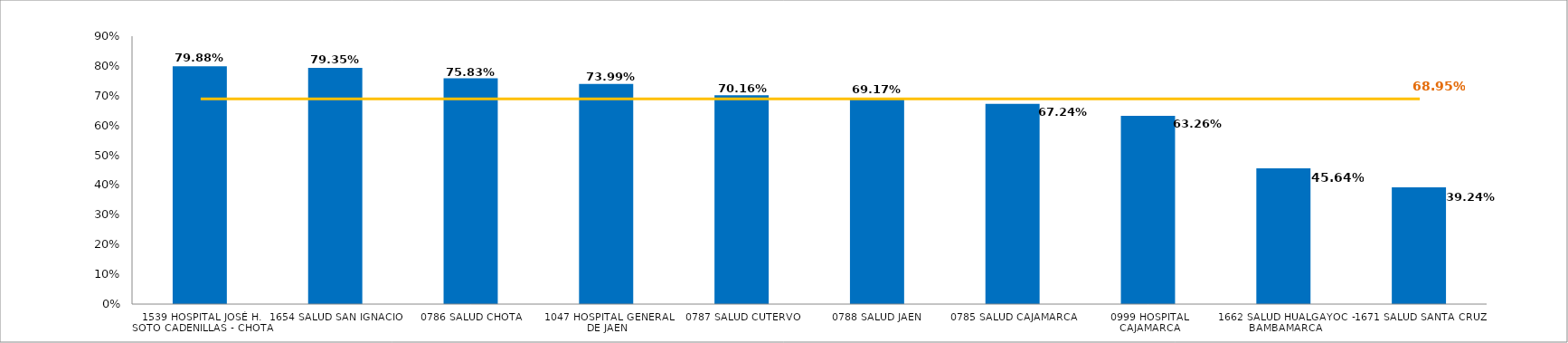
| Category | % EJECUCIÓN  |
|---|---|
| 1539 HOSPITAL JOSÉ H. SOTO CADENILLAS - CHOTA | 0.799 |
| 1654 SALUD SAN IGNACIO | 0.794 |
| 0786 SALUD CHOTA | 0.758 |
| 1047 HOSPITAL GENERAL DE JAEN | 0.74 |
| 0787 SALUD CUTERVO | 0.702 |
| 0788 SALUD JAEN | 0.692 |
| 0785 SALUD CAJAMARCA | 0.672 |
| 0999 HOSPITAL CAJAMARCA | 0.633 |
| 1662 SALUD HUALGAYOC - BAMBAMARCA | 0.456 |
| 1671 SALUD SANTA CRUZ | 0.392 |